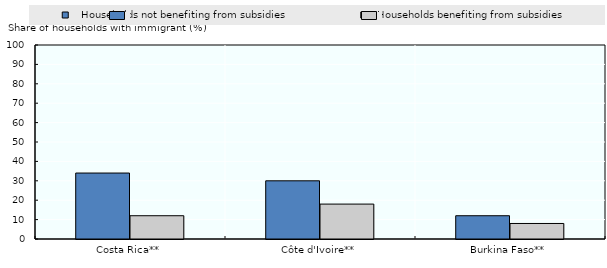
| Category |    Households not benefiting from subsidies |   Households benefiting from subsidies |
|---|---|---|
| Costa Rica** | 34 | 12 |
| Côte d'Ivoire** | 30 | 18 |
| Burkina Faso** | 12 | 8 |